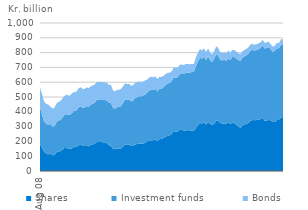
| Category | Shares | Investment funds | Bonds |
|---|---|---|---|
| 2008-08-01 | 186.374 | 243.824 | 132.78 |
| 2008-09-01 | 158.138 | 225.27 | 137.224 |
| 2008-10-01 | 130.57 | 203.624 | 135.853 |
| 2008-11-01 | 119.652 | 200.996 | 133.087 |
| 2008-12-01 | 111.878 | 200.063 | 137.257 |
| 2009-01-01 | 117.92 | 200.445 | 119.266 |
| 2009-02-01 | 107.935 | 195.114 | 120.472 |
| 2009-03-01 | 105.937 | 193.412 | 125.447 |
| 2009-04-01 | 124.798 | 201.695 | 126.611 |
| 2009-05-01 | 134.314 | 207.671 | 125.052 |
| 2009-06-01 | 132.947 | 209.937 | 128.64 |
| 2009-07-01 | 142.02 | 218.929 | 127.719 |
| 2009-08-01 | 155.419 | 223.197 | 127.5 |
| 2009-09-01 | 155.835 | 228.844 | 130.776 |
| 2009-10-01 | 150.917 | 228.7 | 130.173 |
| 2009-11-01 | 150.057 | 232.254 | 129.449 |
| 2009-12-01 | 154.816 | 239.358 | 133.747 |
| 2010-01-01 | 164.805 | 244.01 | 124.739 |
| 2010-02-01 | 162.035 | 247.51 | 126.719 |
| 2010-03-01 | 171.865 | 256.598 | 129.672 |
| 2010-04-01 | 181.126 | 257.834 | 127.553 |
| 2010-05-01 | 170.095 | 256.199 | 129.145 |
| 2010-06-01 | 168.521 | 258.564 | 126.651 |
| 2010-07-01 | 176.23 | 263.403 | 126.194 |
| 2010-08-01 | 166.379 | 264.955 | 127.275 |
| 2010-09-01 | 175.662 | 269.956 | 125.916 |
| 2010-10-01 | 179.996 | 274.175 | 124.188 |
| 2010-11-01 | 183.234 | 278.184 | 122.649 |
| 2010-12-01 | 195.408 | 284.74 | 121.97 |
| 2011-01-01 | 196.725 | 286.865 | 115.89 |
| 2011-02-01 | 196.536 | 288.641 | 118.864 |
| 2011-03-01 | 193.692 | 286.429 | 118.771 |
| 2011-04-01 | 194.33 | 284.612 | 119.428 |
| 2011-05-01 | 187.753 | 289.231 | 120.425 |
| 2011-06-01 | 174.038 | 287.221 | 120.972 |
| 2011-07-01 | 171.514 | 289.531 | 121.206 |
| 2011-08-01 | 149.864 | 278.137 | 118.981 |
| 2011-09-01 | 146.724 | 272.69 | 118.024 |
| 2011-10-01 | 151.106 | 280.258 | 117.107 |
| 2011-11-01 | 152.211 | 280.835 | 115.884 |
| 2011-12-01 | 152.249 | 286.826 | 115.65 |
| 2012-01-01 | 163.983 | 296.805 | 109.911 |
| 2012-02-01 | 179.122 | 303.701 | 109.698 |
| 2012-03-01 | 175.696 | 302.9 | 109.457 |
| 2012-04-01 | 179.494 | 303.637 | 105.759 |
| 2012-05-01 | 168.62 | 301.601 | 105.806 |
| 2012-06-01 | 169.345 | 306.124 | 104.692 |
| 2012-07-01 | 180.095 | 314.8 | 102.702 |
| 2012-08-01 | 182.53 | 315.938 | 102.482 |
| 2012-09-01 | 185.99 | 319.029 | 99.2 |
| 2012-10-01 | 183.777 | 320.527 | 95.912 |
| 2012-11-01 | 186.418 | 325.193 | 94.753 |
| 2012-12-01 | 189.524 | 328.751 | 94.006 |
| 2013-01-01 | 200.819 | 331.704 | 85.095 |
| 2013-02-01 | 206.063 | 337.505 | 89.62 |
| 2013-03-01 | 207.471 | 341.181 | 87.699 |
| 2013-04-01 | 207.972 | 339.326 | 85.797 |
| 2013-05-01 | 212.196 | 343.09 | 84.815 |
| 2013-06-01 | 202.807 | 334.314 | 83.168 |
| 2013-07-01 | 215.398 | 340.885 | 81.078 |
| 2013-08-01 | 217.585 | 337.992 | 79.969 |
| 2013-09-01 | 224.049 | 343.028 | 75.471 |
| 2013-10-01 | 230.732 | 350.466 | 73.755 |
| 2013-11-01 | 237.953 | 352.69 | 72.323 |
| 2013-12-01 | 241.182 | 353.05 | 70.305 |
| 2014-01-01 | 249.232 | 356.73 | 67.006 |
| 2014-02-01 | 270.253 | 363.043 | 66.511 |
| 2014-03-01 | 266.547 | 364.511 | 66.322 |
| 2014-04-01 | 268.053 | 365.215 | 64.52 |
| 2014-05-01 | 278.091 | 376.023 | 63.928 |
| 2014-06-01 | 277.655 | 378.841 | 62.516 |
| 2014-07-01 | 274.001 | 381.474 | 60.884 |
| 2014-08-01 | 273.75 | 388.441 | 60.635 |
| 2014-09-01 | 276.575 | 388.483 | 57.856 |
| 2014-10-01 | 274.88 | 390.986 | 55.353 |
| 2014-11-01 | 272.229 | 396.237 | 55.443 |
| 2014-12-01 | 271.257 | 398.452 | 53.677 |
| 2015-01-01 | 291.663 | 416.904 | 59.851 |
| 2015-02-01 | 307.209 | 432.603 | 60.303 |
| 2015-03-01 | 323.867 | 440.889 | 59.144 |
| 2015-04-01 | 321.187 | 437.739 | 55.635 |
| 2015-05-01 | 329.986 | 444.176 | 55.192 |
| 2015-06-01 | 313.083 | 436.028 | 54.492 |
| 2015-07-01 | 332.074 | 443.33 | 53.07 |
| 2015-08-01 | 318.093 | 429.042 | 52.957 |
| 2015-09-01 | 312.673 | 423.045 | 53.122 |
| 2015-10-01 | 317.546 | 438.849 | 52.558 |
| 2015-11-01 | 341.208 | 449.021 | 52.182 |
| 2015-12-01 | 338.687 | 439.652 | 52.75 |
| 2016-01-01 | 325.443 | 426.873 | 50.983 |
| 2016-02-01 | 319.834 | 425.976 | 51.413 |
| 2016-03-01 | 319.303 | 432.742 | 51.165 |
| 2016-04-01 | 320.025 | 423.933 | 51.063 |
| 2016-05-01 | 329.159 | 433.522 | 51.029 |
| 2016-06-01 | 315.915 | 433.381 | 51.428 |
| 2016-07-01 | 327.806 | 442.753 | 47.948 |
| 2016-08-01 | 322.818 | 446.589 | 47.682 |
| 2016-09-01 | 311.08 | 448.613 | 47.76 |
| 2016-10-01 | 300.822 | 448.769 | 46.162 |
| 2016-11-01 | 291.042 | 453.369 | 45.839 |
| 2016-12-01 | 306.344 | 459.601 | 44.955 |
| 2017-01-01 | 315.141 | 460.178 | 42.708 |
| 2017-02-01 | 316.899 | 465.082 | 43.081 |
| 2017-03-01 | 325.396 | 469.324 | 42.579 |
| 2017-04-01 | 340.392 | 473.453 | 41.744 |
| 2017-05-01 | 345.504 | 472.792 | 39.992 |
| 2017-06-01 | 342.452 | 471.14 | 39.54 |
| 2017-07-01 | 345.912 | 472.888 | 39.049 |
| 2017-08-01 | 349.336 | 474.163 | 39.295 |
| 2017-09-01 | 350.394 | 481.845 | 38.713 |
| 2017-10-01 | 359.085 | 489.433 | 37.822 |
| 2017-11-01 | 337.927 | 488.823 | 37.351 |
| 2017-12-01 | 341.466 | 490.925 | 38.028 |
| 2018-01-01 | 345.654 | 491.621 | 35.734 |
| 2018-02-01 | 340.727 | 479.968 | 34.979 |
| 2018-03-01 | 330.455 | 475.064 | 33.987 |
| 2018-04-01 | 332.191 | 481.343 | 34.91 |
| 2018-05-01 | 343.864 | 486.618 | 35.437 |
| 2018-06-01 | 344.044 | 484.892 | 35.407 |
| 2018-07-01 | 362.482 | 492.062 | 34.84 |
| 2018-08-01 | 363.207 | 492.476 | 35.095 |